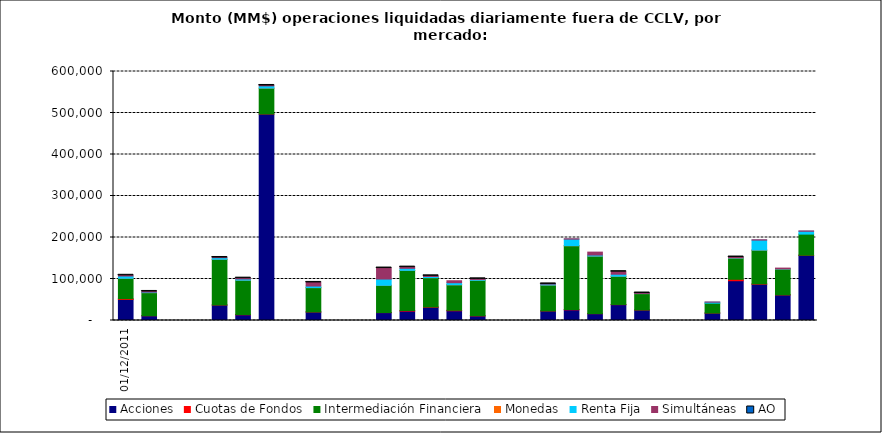
| Category | Acciones | Cuotas de Fondos | Intermediación Financiera | Monedas | Renta Fija | Simultáneas | AO |
|---|---|---|---|---|---|---|---|
| 01/12/2011 | 50527.039 | 2044.632 | 49120.485 | 20.61 | 5521.693 | 1625.022 | 0.142 |
| 02/12/2011 | 11479.273 | 61.44 | 55620.038 | 7.299 | 1336.918 | 1452.399 | 0.371 |
| 05/12/2011 | 37362.908 | 110.012 | 110091.075 | 3.99 | 3887.06 | 388.905 | 0.076 |
| 06/12/2011 | 13800.277 | 558.05 | 82632.465 | 14.465 | 3108.652 | 1846.561 | 0.058 |
| 07/12/2011 | 497539.972 | 186.37 | 62253.884 | 10.91 | 5388.751 | 925.876 | 0.312 |
| 09/12/2011 | 20550.403 | 91.287 | 58609.542 | 3.84 | 3795.889 | 8689.645 | 0.122 |
| 12/12/2011 | 19010.559 | 178.301 | 65514.483 | 14.075 | 15130.062 | 26483.483 | 0.342 |
| 13/12/2011 | 22664.768 | 1389.609 | 96709.795 | 15.356 | 4943.974 | 2858.593 | 0.017 |
| 14/12/2011 | 31858.751 | 820.094 | 70573.219 | 8.288 | 2696.475 | 1620.95 | 0.008 |
| 15/12/2011 | 23461.497 | 1125.667 | 61424.545 | 31.189 | 5031.368 | 4744.411 | 0 |
| 16/12/2011 | 11042.394 | 536.173 | 85215.693 | 21.4 | 2052.813 | 1482.083 | 0.024 |
| 19/12/2011 | 22992.714 | 165.747 | 62261.939 | 6.84 | 2277.973 | 403.686 | 0.006 |
| 20/12/2011 | 25667.973 | 1117.034 | 153415.608 | 37.74 | 15718.996 | 979.478 | 0 |
| 21/12/2011 | 16477.732 | 190.766 | 138492.296 | 10.496 | 2578.761 | 7028.589 | 0 |
| 22/12/2011 | 38169.977 | 490.798 | 67927.031 | 5.547 | 4872.686 | 6131.173 | 0.003 |
| 23/12/2011 | 25293.248 | 140.333 | 39407.624 | 1.517 | 379.07 | 954.611 | 0.012 |
| 26/12/2011 | 17951.919 | 0.005 | 23757.555 | 0 | 2458.801 | 446.191 | 0 |
| 27/12/2011 | 95829.889 | 3468.171 | 51211.299 | 25.863 | 947.418 | 1412.498 | 0.022 |
| 28/12/2011 | 87376.518 | 938.992 | 81237.984 | 24.364 | 24144.412 | 870.34 | 0 |
| 29/12/2011 | 61623.298 | 313.856 | 62087.289 | 0.28 | 704.466 | 1556.348 | 0 |
| 30/12/2011 | 157057.621 | 215.184 | 50884.033 | 0 | 6894.556 | 777.784 | 0 |